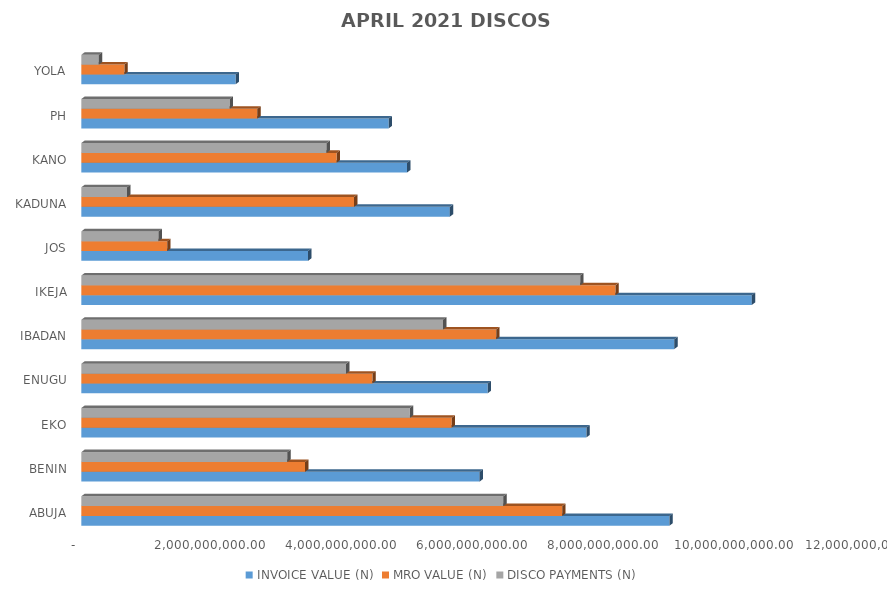
| Category | INVOICE VALUE (N) | MRO VALUE (N) | DISCO PAYMENTS (N) |
|---|---|---|---|
| ABUJA | 8982293220.396 | 7344821166.318 | 6445693614.96 |
| BENIN | 6082925304.068 | 3417995728.356 | 3145480674.727 |
| EKO | 7713889303.972 | 5656595026.603 | 5018656381.16 |
| ENUGU | 6206094666.418 | 4445425609.555 | 4042650065.704 |
| IBADAN | 9055937134.249 | 6335533619.121 | 5524121651.888 |
| IKEJA | 10239858442.445 | 8157071235.251 | 7619478667.02 |
| JOS | 3462762406.52 | 1311694399.59 | 1180109428.14 |
| KADUNA | 5628180589.417 | 4164853636.169 | 699351912.6 |
| KANO | 4974901390.693 | 3899327710.025 | 3745105766.912 |
| PH | 4694401228.82 | 2688483583.745 | 2265987473.147 |
| YOLA | 2357436823.039 | 658432104.675 | 267526013.15 |